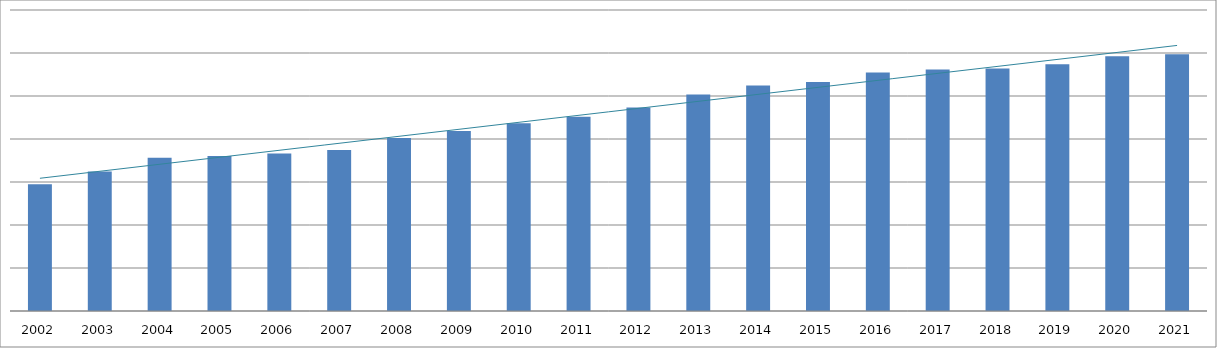
| Category | Series 0 |
|---|---|
| 2002.0 | 294892289.45 |
| 2003.0 | 324674559.27 |
| 2004.0 | 356443907.72 |
| 2005.0 | 360413676.69 |
| 2006.0 | 366245828.47 |
| 2007.0 | 374133411.83 |
| 2008.0 | 402466036.66 |
| 2009.0 | 418837177.25 |
| 2010.0 | 436606254.84 |
| 2011.0 | 451693306.3 |
| 2012.0 | 473322154.72 |
| 2013.0 | 503589756.13 |
| 2014.0 | 524142608.99 |
| 2015.0 | 532292921.01 |
| 2016.0 | 554484013.58 |
| 2017.0 | 561710446.55 |
| 2018.0 | 564174288.7 |
| 2019.0 | 573630368.18 |
| 2020.0 | 592292188.9 |
| 2021.0 | 596899029.92 |